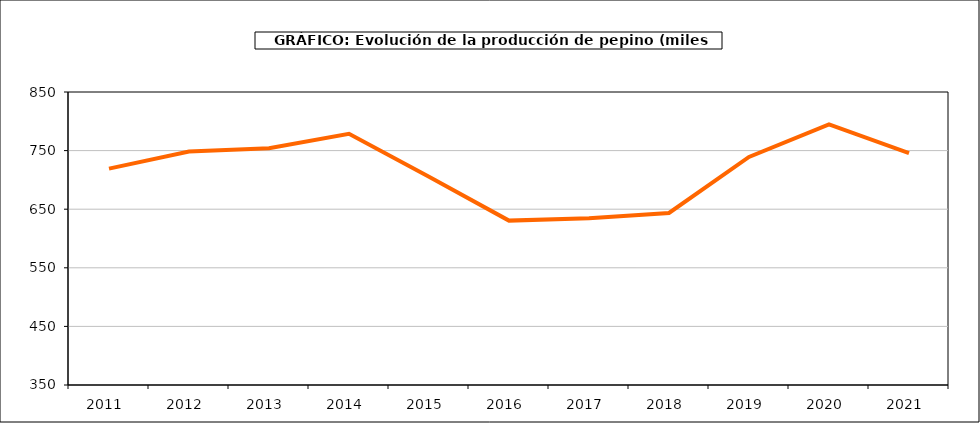
| Category | producción |
|---|---|
| 2011.0 | 719.219 |
| 2012.0 | 748.5 |
| 2013.0 | 753.941 |
| 2014.0 | 778.571 |
| 2015.0 | 705.223 |
| 2016.0 | 630.525 |
| 2017.0 | 634.43 |
| 2018.0 | 643.621 |
| 2019.0 | 739.165 |
| 2020.0 | 794.867 |
| 2021.0 | 745.861 |